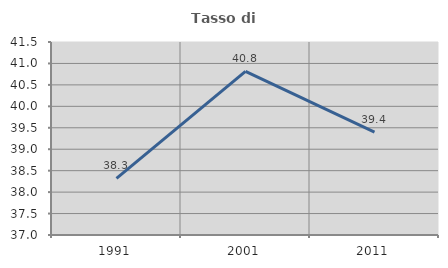
| Category | Tasso di occupazione   |
|---|---|
| 1991.0 | 38.32 |
| 2001.0 | 40.814 |
| 2011.0 | 39.4 |